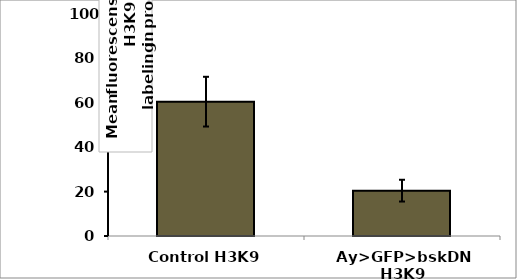
| Category | Series 0 |
|---|---|
| Control H3K9 | 60.515 |
| Ay>GFP>bskDN H3K9 | 20.428 |